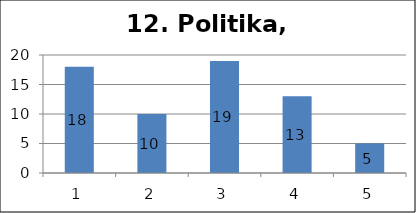
| Category | Series 1 |
|---|---|
| 0 | 18 |
| 1 | 10 |
| 2 | 19 |
| 3 | 13 |
| 4 | 5 |